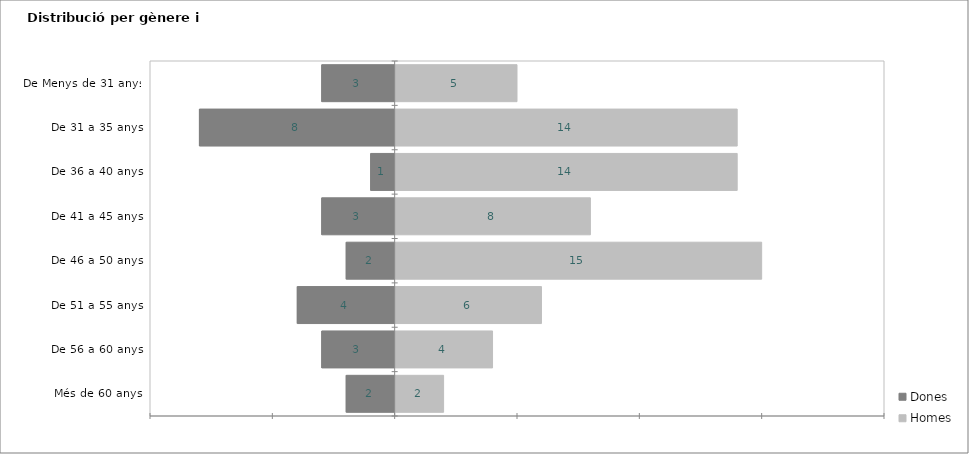
| Category | Dones | Homes |
|---|---|---|
| Més de 60 anys | -2 | 2 |
| De 56 a 60 anys | -3 | 4 |
| De 51 a 55 anys | -4 | 6 |
| De 46 a 50 anys | -2 | 15 |
| De 41 a 45 anys | -3 | 8 |
| De 36 a 40 anys | -1 | 14 |
| De 31 a 35 anys | -8 | 14 |
| De Menys de 31 anys | -3 | 5 |